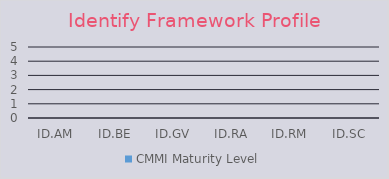
| Category | CMMI Maturity Level |
|---|---|
| ID.AM | 0 |
| ID.BE | 0 |
| ID.GV | 0 |
| ID.RA | 0 |
| ID.RM | 0 |
| ID.SC | 0 |